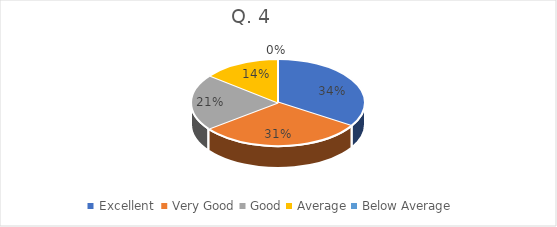
| Category | Series 0 |
|---|---|
| Excellent  | 52 |
| Very Good | 47 |
| Good | 32 |
| Average | 22 |
| Below Average | 0 |